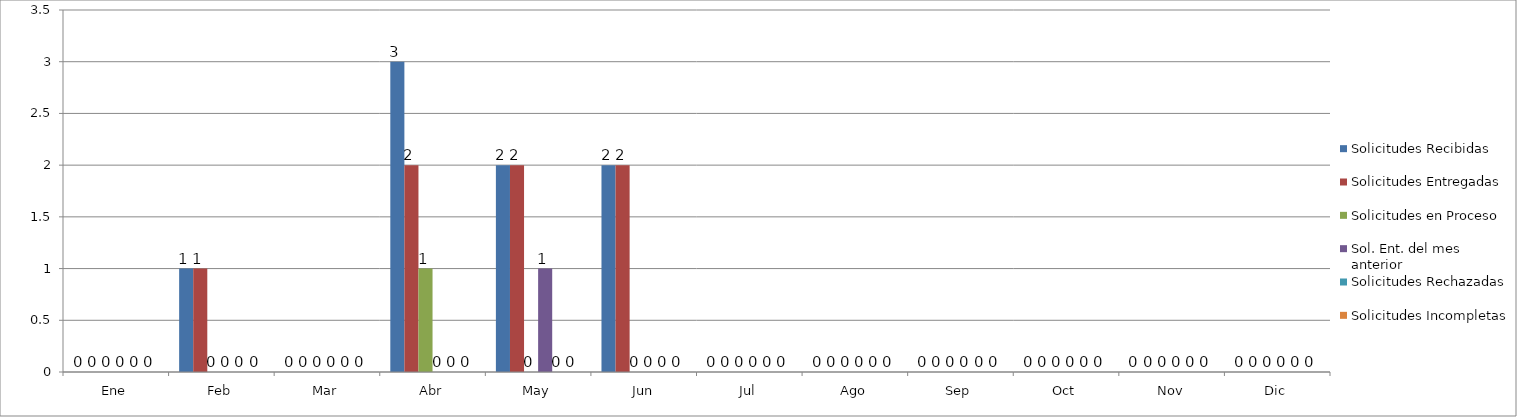
| Category | Solicitudes Recibidas  | Solicitudes Entregadas | Solicitudes en Proceso | Sol. Ent. del mes anterior | Solicitudes Rechazadas | Solicitudes Incompletas |
|---|---|---|---|---|---|---|
| Ene | 0 | 0 | 0 | 0 | 0 | 0 |
| Feb | 1 | 1 | 0 | 0 | 0 | 0 |
| Mar | 0 | 0 | 0 | 0 | 0 | 0 |
| Abr | 3 | 2 | 1 | 0 | 0 | 0 |
| May | 2 | 2 | 0 | 1 | 0 | 0 |
| Jun | 2 | 2 | 0 | 0 | 0 | 0 |
| Jul | 0 | 0 | 0 | 0 | 0 | 0 |
| Ago | 0 | 0 | 0 | 0 | 0 | 0 |
| Sep | 0 | 0 | 0 | 0 | 0 | 0 |
| Oct | 0 | 0 | 0 | 0 | 0 | 0 |
| Nov | 0 | 0 | 0 | 0 | 0 | 0 |
| Dic | 0 | 0 | 0 | 0 | 0 | 0 |